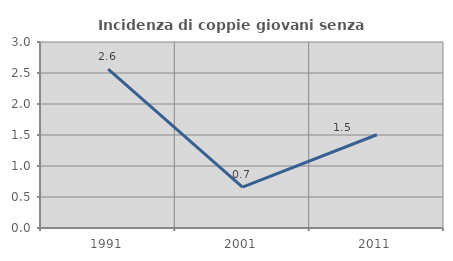
| Category | Incidenza di coppie giovani senza figli |
|---|---|
| 1991.0 | 2.564 |
| 2001.0 | 0.658 |
| 2011.0 | 1.504 |